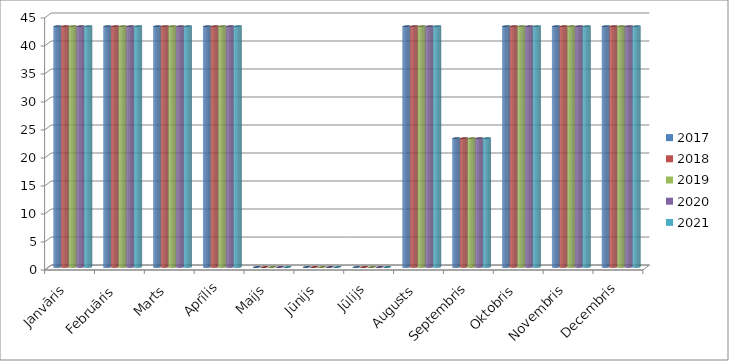
| Category | 2017 | 2018 | 2019 | 2020 | 2021 |
|---|---|---|---|---|---|
| Janvāris | 43 | 43 | 43 | 43 | 43 |
| Februāris | 43 | 43 | 43 | 43 | 43 |
| Marts | 43 | 43 | 43 | 43 | 43 |
| Aprīlis | 43 | 43 | 43 | 43 | 43 |
| Maijs | 0 | 0 | 0 | 0 | 0 |
| Jūnijs | 0 | 0 | 0 | 0 | 0 |
| Jūlijs | 0 | 0 | 0 | 0 | 0 |
| Augusts | 43 | 43 | 43 | 43 | 43 |
| Septembris | 23 | 23 | 23 | 23 | 23 |
| Oktobris | 43 | 43 | 43 | 43 | 43 |
| Novembris | 43 | 43 | 43 | 43 | 43 |
| Decembris | 43 | 43 | 43 | 43 | 43 |